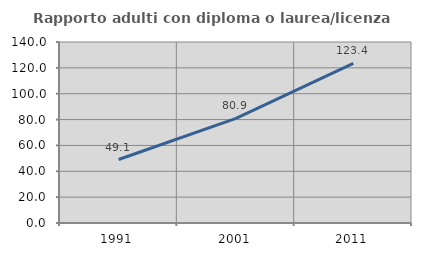
| Category | Rapporto adulti con diploma o laurea/licenza media  |
|---|---|
| 1991.0 | 49.087 |
| 2001.0 | 80.942 |
| 2011.0 | 123.391 |